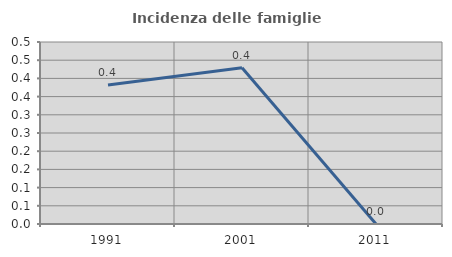
| Category | Incidenza delle famiglie numerose |
|---|---|
| 1991.0 | 0.382 |
| 2001.0 | 0.429 |
| 2011.0 | 0 |